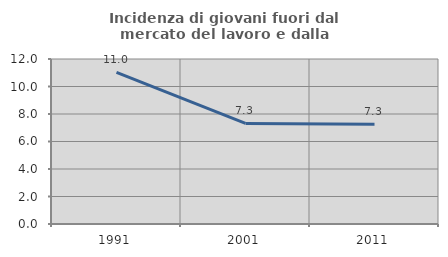
| Category | Incidenza di giovani fuori dal mercato del lavoro e dalla formazione  |
|---|---|
| 1991.0 | 11.024 |
| 2001.0 | 7.317 |
| 2011.0 | 7.259 |